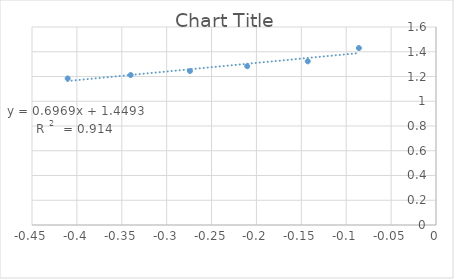
| Category | Series 0 |
|---|---|
| -0.08586848736910616 | 1.43 |
| -0.14283039454341226 | 1.323 |
| -0.21027830601907818 | 1.283 |
| -0.2740883677049518 | 1.244 |
| -0.34008379993014975 | 1.212 |
| -0.41027374374576303 | 1.184 |